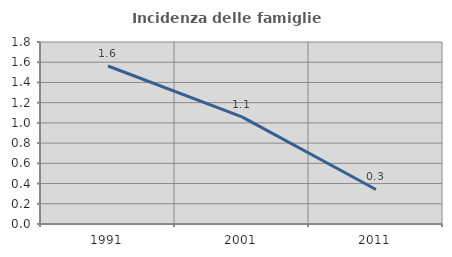
| Category | Incidenza delle famiglie numerose |
|---|---|
| 1991.0 | 1.562 |
| 2001.0 | 1.06 |
| 2011.0 | 0.341 |